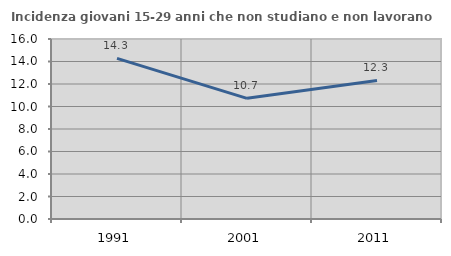
| Category | Incidenza giovani 15-29 anni che non studiano e non lavorano  |
|---|---|
| 1991.0 | 14.273 |
| 2001.0 | 10.727 |
| 2011.0 | 12.314 |